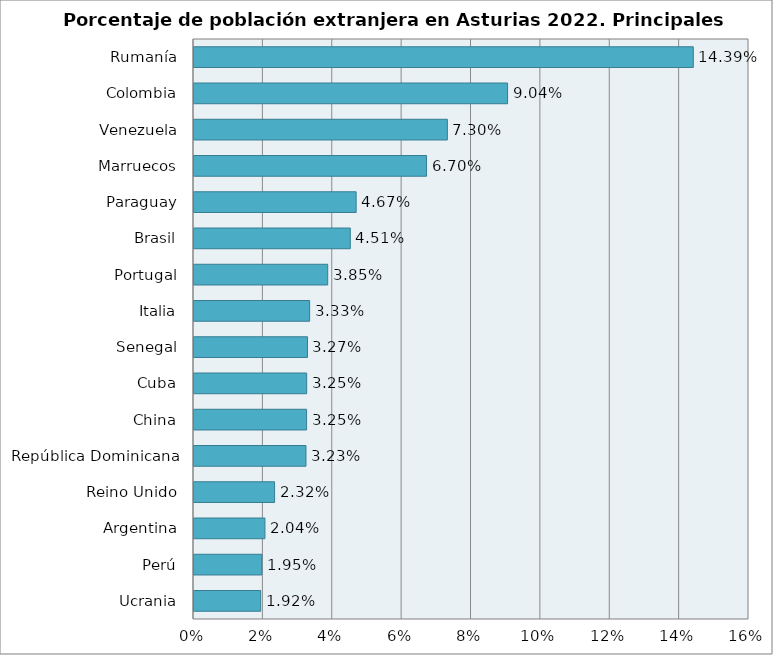
| Category | Series 0 |
|---|---|
| Ucrania | 0.019 |
| Perú | 0.02 |
| Argentina | 0.02 |
| Reino Unido | 0.023 |
| República Dominicana | 0.032 |
| China | 0.032 |
| Cuba | 0.032 |
| Senegal | 0.033 |
| Italia | 0.033 |
| Portugal | 0.039 |
| Brasil | 0.045 |
| Paraguay | 0.047 |
| Marruecos | 0.067 |
| Venezuela | 0.073 |
| Colombia | 0.09 |
| Rumanía | 0.144 |